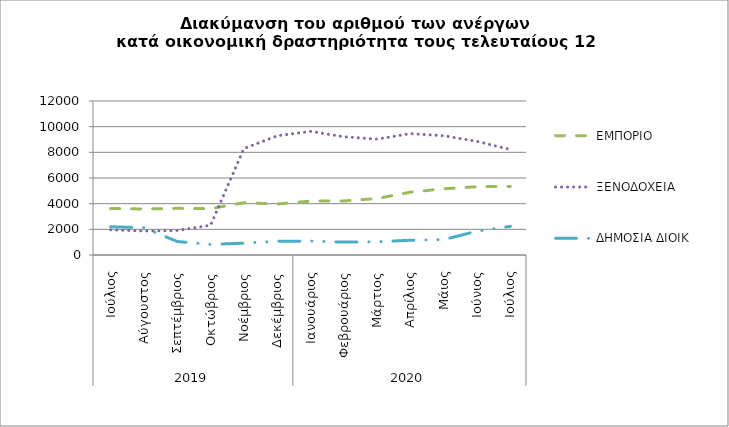
| Category | ΕΜΠΟΡΙΟ | ΞΕΝΟΔΟΧΕΙΑ | ΔΗΜΟΣΙΑ ΔΙΟΙΚ |
|---|---|---|---|
| 0 | 3623 | 1961 | 2202 |
| 1 | 3586 | 1872 | 2125 |
| 2 | 3637 | 1911 | 1050 |
| 3 | 3610 | 2319 | 826 |
| 4 | 4072 | 8292 | 922 |
| 5 | 3969 | 9290 | 1069 |
| 6 | 4202 | 9632 | 1085 |
| 7 | 4212 | 9214 | 1003 |
| 8 | 4400 | 9028 | 1034 |
| 9 | 4898 | 9457 | 1149 |
| 10 | 5162 | 9293 | 1202 |
| 11 | 5321 | 8852 | 1854 |
| 12 | 5347 | 8216 | 2234 |